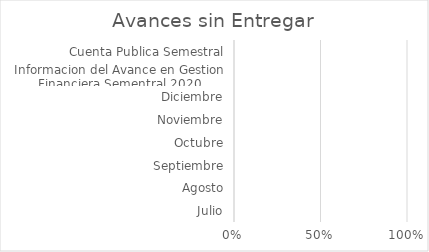
| Category | Series 0 |
|---|---|
| Julio | 0 |
| Agosto | 0 |
| Septiembre | 0 |
| Octubre | 0 |
| Noviembre | 0 |
| Diciembre | 0 |
| Informacion del Avance en Gestion Financiera Sementral 2020 | 0 |
| Cuenta Publica Semestral | 0 |